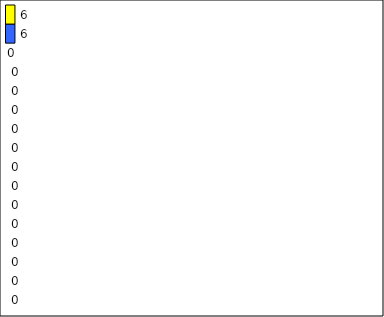
| Category | -2 | -1 | 0 | 1 | 2 | 3 | 4 | 5 | 6 | 7 | 8 | 9 | 10 | 11 | 12 | Perfect Round |
|---|---|---|---|---|---|---|---|---|---|---|---|---|---|---|---|---|
| 0 | 0 | 0 | 0 | 0 | 0 | 0 | 0 | 0 | 0 | 0 | 0 | 0 | 0 | 0 | 6 | 6 |